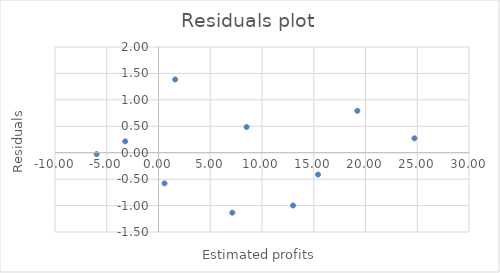
| Category | Series 0 |
|---|---|
| -5.974860335195525 | -0.025 |
| -3.2150837988826773 | 0.215 |
| 0.579608938547489 | -0.58 |
| 1.6145251396648082 | 1.385 |
| 7.134078212290506 | -1.134 |
| 8.51396648044693 | 0.486 |
| 12.998603351955309 | -0.999 |
| 15.413407821229049 | -0.413 |
| 19.20810055865922 | 0.792 |
| 24.727653631284916 | 0.272 |